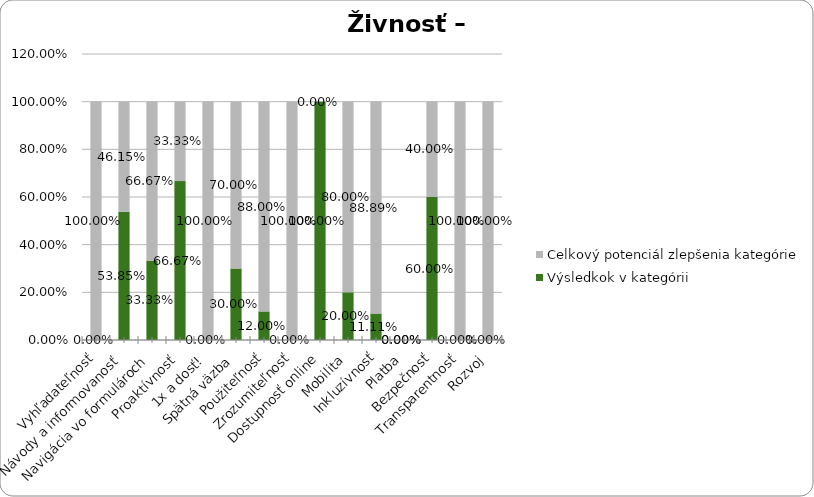
| Category | Výsledkok v kategórii | Celkový potenciál zlepšenia kategórie |
|---|---|---|
| Vyhľadateľnosť | 0 | 1 |
| Návody a informovanosť | 0.538 | 0.462 |
| Navigácia vo formulároch | 0.333 | 0.667 |
| Proaktívnosť | 0.667 | 0.333 |
| 1x a dosť! | 0 | 1 |
| Spätná väzba | 0.3 | 0.7 |
| Použiteľnosť | 0.12 | 0.88 |
| Zrozumiteľnosť | 0 | 1 |
| Dostupnosť online | 1 | 0 |
| Mobilita | 0.2 | 0.8 |
| Inkluzívnosť | 0.111 | 0.889 |
| Platba | 0 | 0 |
| Bezpečnosť | 0.6 | 0.4 |
| Transparentnosť | 0 | 1 |
| Rozvoj | 0 | 1 |